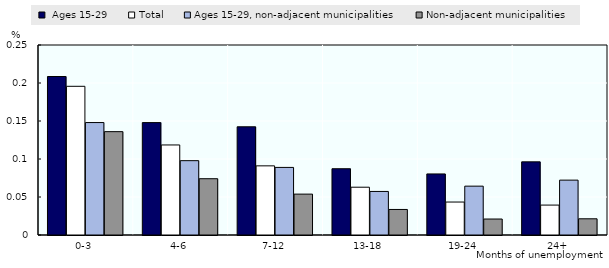
| Category |  Ages 15-29 | Total | Ages 15-29, non-adjacent municipalities | Non-adjacent municipalities |
|---|---|---|---|---|
| 0-3 | 0.209 | 0.196 | 0.148 | 0.136 |
| 4-6 | 0.148 | 0.118 | 0.098 | 0.074 |
| 7-12 | 0.142 | 0.091 | 0.089 | 0.054 |
| 13-18 | 0.087 | 0.063 | 0.057 | 0.034 |
| 19-24 | 0.08 | 0.043 | 0.064 | 0.021 |
| 24+ | 0.096 | 0.039 | 0.072 | 0.021 |